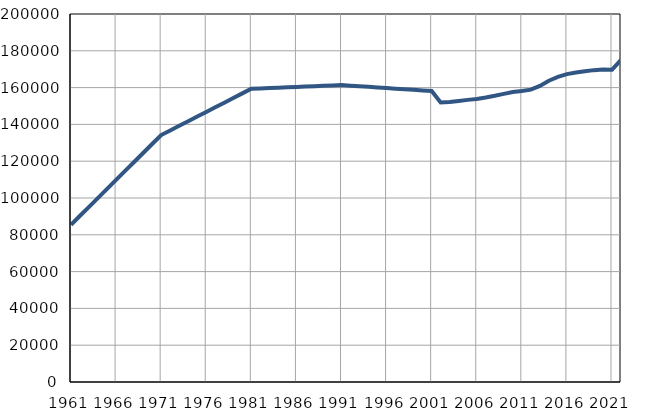
| Category | Population
size |
|---|---|
| 1961.0 | 85458 |
| 1962.0 | 90333 |
| 1963.0 | 95207 |
| 1964.0 | 100082 |
| 1965.0 | 104957 |
| 1966.0 | 109832 |
| 1967.0 | 114707 |
| 1968.0 | 119582 |
| 1969.0 | 124457 |
| 1970.0 | 129331 |
| 1971.0 | 134206 |
| 1972.0 | 136722 |
| 1973.0 | 139238 |
| 1974.0 | 141753 |
| 1975.0 | 144269 |
| 1976.0 | 146784 |
| 1977.0 | 149301 |
| 1978.0 | 151817 |
| 1979.0 | 154332 |
| 1980.0 | 156847 |
| 1981.0 | 159364 |
| 1982.0 | 159565 |
| 1983.0 | 159766 |
| 1984.0 | 159968 |
| 1985.0 | 160169 |
| 1986.0 | 160370 |
| 1987.0 | 160571 |
| 1988.0 | 160772 |
| 1989.0 | 160974 |
| 1990.0 | 161175 |
| 1991.0 | 161376 |
| 1992.0 | 161052 |
| 1993.0 | 160729 |
| 1994.0 | 160405 |
| 1995.0 | 160082 |
| 1996.0 | 159758 |
| 1997.0 | 159435 |
| 1998.0 | 159111 |
| 1999.0 | 158788 |
| 2000.0 | 158464 |
| 2001.0 | 158141 |
| 2002.0 | 151940 |
| 2003.0 | 152126 |
| 2004.0 | 152697 |
| 2005.0 | 153334 |
| 2006.0 | 153861 |
| 2007.0 | 154648 |
| 2008.0 | 155548 |
| 2009.0 | 156569 |
| 2010.0 | 157637 |
| 2011.0 | 158156 |
| 2012.0 | 158904 |
| 2013.0 | 160916 |
| 2014.0 | 163764 |
| 2015.0 | 165811 |
| 2016.0 | 167331 |
| 2017.0 | 168242 |
| 2018.0 | 168841 |
| 2019.0 | 169495 |
| 2020.0 | 169810 |
| 2021.0 | 169695 |
| 2022.0 | 175055 |